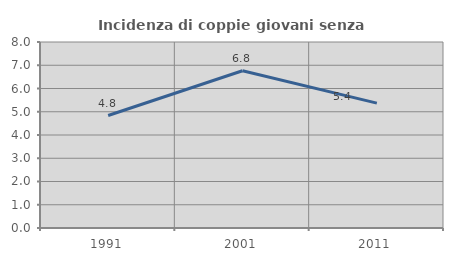
| Category | Incidenza di coppie giovani senza figli |
|---|---|
| 1991.0 | 4.839 |
| 2001.0 | 6.764 |
| 2011.0 | 5.371 |